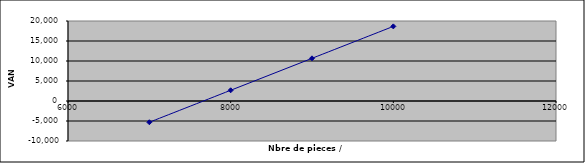
| Category | VAN |
|---|---|
| 7000.0 | -5309.771 |
| 8000.0 | 2678.166 |
| 9000.0 | 10666.103 |
| 10000.0 | 18654.041 |